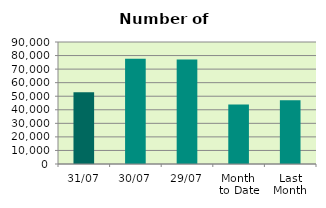
| Category | Series 0 |
|---|---|
| 31/07 | 52852 |
| 30/07 | 77592 |
| 29/07 | 77014 |
| Month 
to Date | 43867.217 |
| Last
Month | 46980.273 |